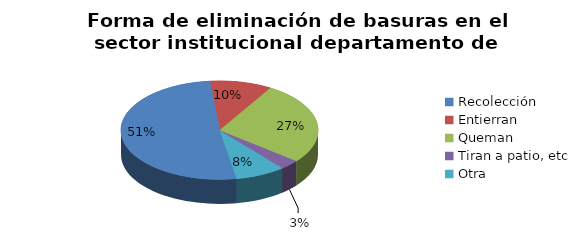
| Category | Series 0 |
|---|---|
| Recolección | 0.512 |
| Entierran | 0.102 |
| Queman | 0.272 |
| Tiran a patio, etc | 0.032 |
| Otra | 0.082 |